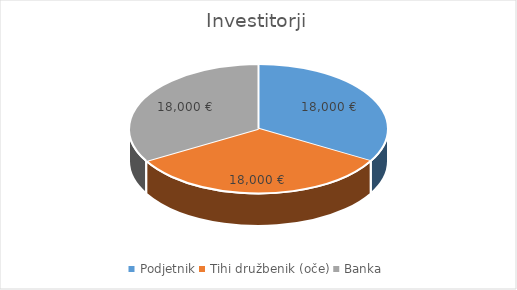
| Category | Series 0 |
|---|---|
| Podjetnik | 18000 |
| Tihi družbenik (oče) | 18000 |
| Banka | 18000 |